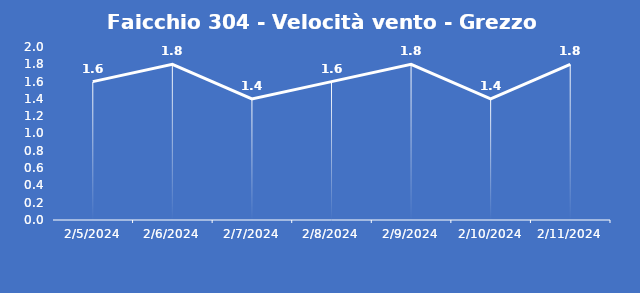
| Category | Faicchio 304 - Velocità vento - Grezzo (m/s) |
|---|---|
| 2/5/24 | 1.6 |
| 2/6/24 | 1.8 |
| 2/7/24 | 1.4 |
| 2/8/24 | 1.6 |
| 2/9/24 | 1.8 |
| 2/10/24 | 1.4 |
| 2/11/24 | 1.8 |